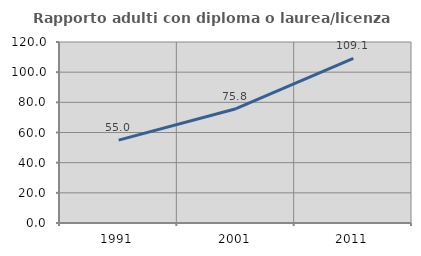
| Category | Rapporto adulti con diploma o laurea/licenza media  |
|---|---|
| 1991.0 | 54.967 |
| 2001.0 | 75.758 |
| 2011.0 | 109.145 |